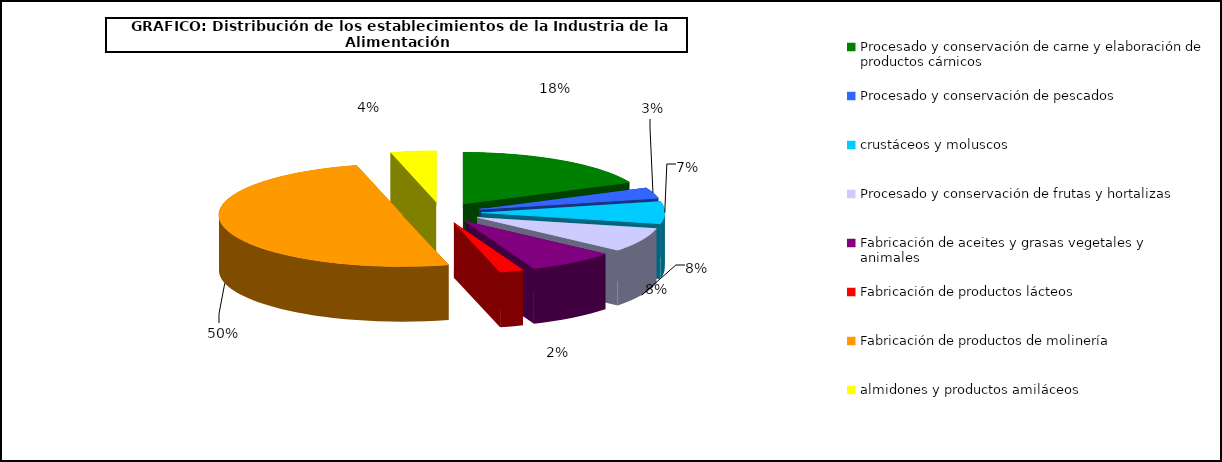
| Category | Procesado y conservación de carne y elaboración de productos cárnicos |
|---|---|
| 0 | 4727 |
| 1 | 884 |
| 2 | 1821 |
| 3 | 1995 |
| 4 | 2020 |
| 5 | 546 |
| 6 | 13065 |
| 7 | 1045 |